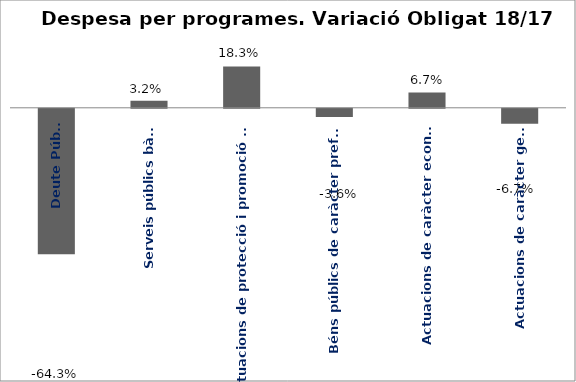
| Category | Series 0 |
|---|---|
| Deute Públic | -0.643 |
| Serveis públics bàsics | 0.032 |
| Actuacions de protecció i promoció social | 0.183 |
| Béns públics de caràcter preferent | -0.036 |
| Actuacions de caràcter econòmic | 0.067 |
| Actuacions de caràcter general | -0.067 |